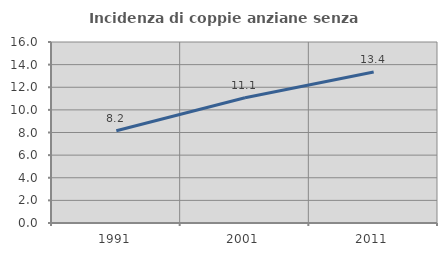
| Category | Incidenza di coppie anziane senza figli  |
|---|---|
| 1991.0 | 8.154 |
| 2001.0 | 11.072 |
| 2011.0 | 13.351 |